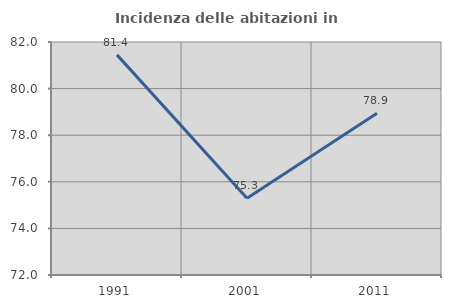
| Category | Incidenza delle abitazioni in proprietà  |
|---|---|
| 1991.0 | 81.447 |
| 2001.0 | 75.298 |
| 2011.0 | 78.939 |